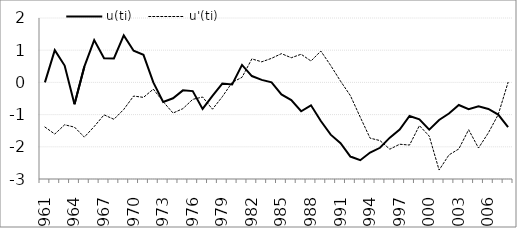
| Category | u(ti) | u'(ti) | Series 2 | Series 3 |
|---|---|---|---|---|
| 1961.0 | 0 | -1.387 |  |  |
| 1962.0 | 1 | -1.605 |  |  |
| 1963.0 | 0.522 | -1.316 |  |  |
| 1964.0 | -0.679 | -1.389 |  |  |
| 1965.0 | 0.49 | -1.699 |  |  |
| 1966.0 | 1.315 | -1.371 |  |  |
| 1967.0 | 0.751 | -1.008 |  |  |
| 1968.0 | 0.742 | -1.146 |  |  |
| 1969.0 | 1.46 | -0.839 |  |  |
| 1970.0 | 0.984 | -0.423 |  |  |
| 1971.0 | 0.856 | -0.465 |  |  |
| 1972.0 | 0 | -0.209 |  |  |
| 1973.0 | -0.61 | -0.599 |  |  |
| 1974.0 | -0.493 | -0.951 |  |  |
| 1975.0 | -0.247 | -0.815 |  |  |
| 1976.0 | -0.27 | -0.527 |  |  |
| 1977.0 | -0.824 | -0.454 |  |  |
| 1978.0 | -0.417 | -0.833 |  |  |
| 1979.0 | -0.035 | -0.446 |  |  |
| 1980.0 | -0.065 | 0 |  |  |
| 1981.0 | 0.544 | 0.158 |  |  |
| 1982.0 | 0.197 | 0.73 |  |  |
| 1983.0 | 0.079 | 0.639 |  |  |
| 1984.0 | 0 | 0.747 |  |  |
| 1985.0 | -0.374 | 0.893 |  |  |
| 1986.0 | -0.551 | 0.766 |  |  |
| 1987.0 | -0.896 | 0.874 |  |  |
| 1988.0 | -0.711 | 0.664 |  |  |
| 1989.0 | -1.201 | 0.973 |  |  |
| 1990.0 | -1.624 | 0.525 |  |  |
| 1991.0 | -1.887 | 0.038 |  |  |
| 1992.0 | -2.303 | -0.412 |  |  |
| 1993.0 | -2.417 | -1.081 |  |  |
| 1994.0 | -2.179 | -1.732 |  |  |
| 1995.0 | -2.031 | -1.807 |  |  |
| 1996.0 | -1.716 | -2.074 |  |  |
| 1997.0 | -1.465 | -1.92 |  |  |
| 1998.0 | -1.043 | -1.946 |  |  |
| 1999.0 | -1.149 | -1.342 |  |  |
| 2000.0 | -1.468 | -1.668 |  |  |
| 2001.0 | -1.168 | -2.722 |  |  |
| 2002.0 | -0.965 | -2.253 |  |  |
| 2003.0 | -0.701 | -2.067 |  |  |
| 2004.0 | -0.829 | -1.47 |  |  |
| 2005.0 | -0.743 | -2.038 |  |  |
| 2006.0 | -0.824 | -1.567 |  |  |
| 2007.0 | -1 | -1 |  |  |
| 2008.0 | -1.387 | 0 |  |  |